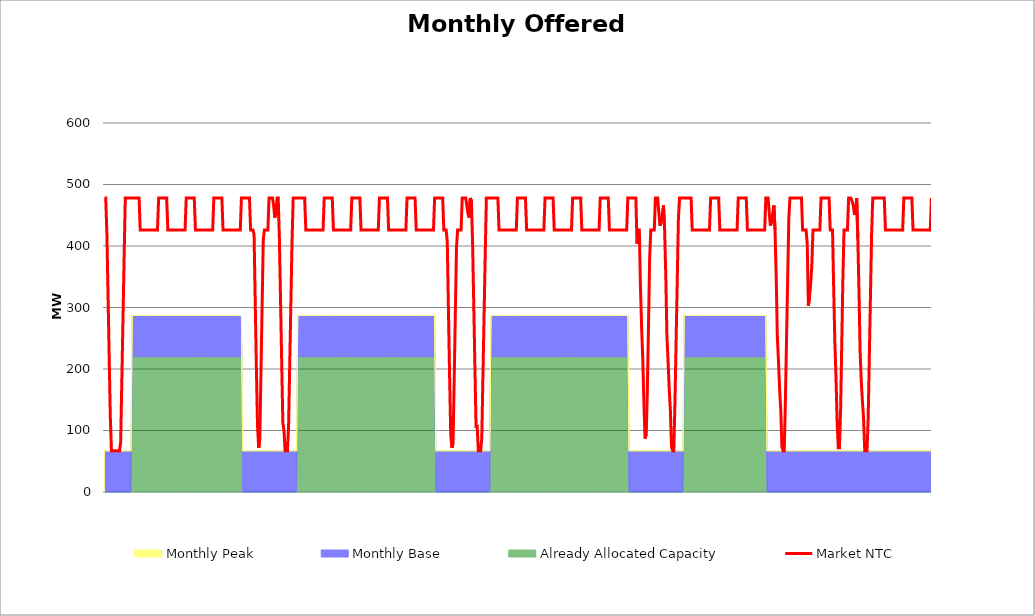
| Category | Market NTC |
|---|---|
| 0 | 478 |
| 1 | 478 |
| 2 | 421 |
| 3 | 321 |
| 4 | 221 |
| 5 | 121 |
| 6 | 67 |
| 7 | 67 |
| 8 | 67 |
| 9 | 67 |
| 10 | 67 |
| 11 | 67 |
| 12 | 67 |
| 13 | 67 |
| 14 | 81 |
| 15 | 181 |
| 16 | 281 |
| 17 | 381 |
| 18 | 478 |
| 19 | 478 |
| 20 | 478 |
| 21 | 478 |
| 22 | 478 |
| 23 | 478 |
| 24 | 478 |
| 25 | 478 |
| 26 | 478 |
| 27 | 478 |
| 28 | 478 |
| 29 | 478 |
| 30 | 478 |
| 31 | 426 |
| 32 | 426 |
| 33 | 426 |
| 34 | 426 |
| 35 | 426 |
| 36 | 426 |
| 37 | 426 |
| 38 | 426 |
| 39 | 426 |
| 40 | 426 |
| 41 | 426 |
| 42 | 426 |
| 43 | 426 |
| 44 | 426 |
| 45 | 426 |
| 46 | 426 |
| 47 | 478 |
| 48 | 478 |
| 49 | 478 |
| 50 | 478 |
| 51 | 478 |
| 52 | 478 |
| 53 | 478 |
| 54 | 478 |
| 55 | 426 |
| 56 | 426 |
| 57 | 426 |
| 58 | 426 |
| 59 | 426 |
| 60 | 426 |
| 61 | 426 |
| 62 | 426 |
| 63 | 426 |
| 64 | 426 |
| 65 | 426 |
| 66 | 426 |
| 67 | 426 |
| 68 | 426 |
| 69 | 426 |
| 70 | 426 |
| 71 | 478 |
| 72 | 478 |
| 73 | 478 |
| 74 | 478 |
| 75 | 478 |
| 76 | 478 |
| 77 | 478 |
| 78 | 478 |
| 79 | 426 |
| 80 | 426 |
| 81 | 426 |
| 82 | 426 |
| 83 | 426 |
| 84 | 426 |
| 85 | 426 |
| 86 | 426 |
| 87 | 426 |
| 88 | 426 |
| 89 | 426 |
| 90 | 426 |
| 91 | 426 |
| 92 | 426 |
| 93 | 426 |
| 94 | 426 |
| 95 | 478 |
| 96 | 478 |
| 97 | 478 |
| 98 | 478 |
| 99 | 478 |
| 100 | 478 |
| 101 | 478 |
| 102 | 478 |
| 103 | 426 |
| 104 | 426 |
| 105 | 426 |
| 106 | 426 |
| 107 | 426 |
| 108 | 426 |
| 109 | 426 |
| 110 | 426 |
| 111 | 426 |
| 112 | 426 |
| 113 | 426 |
| 114 | 426 |
| 115 | 426 |
| 116 | 426 |
| 117 | 426 |
| 118 | 426 |
| 119 | 478 |
| 120 | 478 |
| 121 | 478 |
| 122 | 478 |
| 123 | 478 |
| 124 | 478 |
| 125 | 478 |
| 126 | 478 |
| 127 | 426 |
| 128 | 426 |
| 129 | 426 |
| 130 | 419 |
| 131 | 310 |
| 132 | 202 |
| 133 | 108 |
| 134 | 72 |
| 135 | 87 |
| 136 | 195 |
| 137 | 303 |
| 138 | 411 |
| 139 | 426 |
| 140 | 426 |
| 141 | 426 |
| 142 | 426 |
| 143 | 478 |
| 144 | 478 |
| 145 | 478 |
| 146 | 478 |
| 147 | 466 |
| 148 | 446 |
| 149 | 453 |
| 150 | 478 |
| 151 | 478 |
| 152 | 413 |
| 153 | 313 |
| 154 | 213 |
| 155 | 113 |
| 156 | 100 |
| 157 | 67 |
| 158 | 67 |
| 159 | 67 |
| 160 | 107 |
| 161 | 207 |
| 162 | 307 |
| 163 | 406 |
| 164 | 478 |
| 165 | 478 |
| 166 | 478 |
| 167 | 478 |
| 168 | 478 |
| 169 | 478 |
| 170 | 478 |
| 171 | 478 |
| 172 | 478 |
| 173 | 478 |
| 174 | 478 |
| 175 | 426 |
| 176 | 426 |
| 177 | 426 |
| 178 | 426 |
| 179 | 426 |
| 180 | 426 |
| 181 | 426 |
| 182 | 426 |
| 183 | 426 |
| 184 | 426 |
| 185 | 426 |
| 186 | 426 |
| 187 | 426 |
| 188 | 426 |
| 189 | 426 |
| 190 | 426 |
| 191 | 478 |
| 192 | 478 |
| 193 | 478 |
| 194 | 478 |
| 195 | 478 |
| 196 | 478 |
| 197 | 478 |
| 198 | 478 |
| 199 | 426 |
| 200 | 426 |
| 201 | 426 |
| 202 | 426 |
| 203 | 426 |
| 204 | 426 |
| 205 | 426 |
| 206 | 426 |
| 207 | 426 |
| 208 | 426 |
| 209 | 426 |
| 210 | 426 |
| 211 | 426 |
| 212 | 426 |
| 213 | 426 |
| 214 | 426 |
| 215 | 478 |
| 216 | 478 |
| 217 | 478 |
| 218 | 478 |
| 219 | 478 |
| 220 | 478 |
| 221 | 478 |
| 222 | 478 |
| 223 | 426 |
| 224 | 426 |
| 225 | 426 |
| 226 | 426 |
| 227 | 426 |
| 228 | 426 |
| 229 | 426 |
| 230 | 426 |
| 231 | 426 |
| 232 | 426 |
| 233 | 426 |
| 234 | 426 |
| 235 | 426 |
| 236 | 426 |
| 237 | 426 |
| 238 | 426 |
| 239 | 478 |
| 240 | 478 |
| 241 | 478 |
| 242 | 478 |
| 243 | 478 |
| 244 | 478 |
| 245 | 478 |
| 246 | 478 |
| 247 | 426 |
| 248 | 426 |
| 249 | 426 |
| 250 | 426 |
| 251 | 426 |
| 252 | 426 |
| 253 | 426 |
| 254 | 426 |
| 255 | 426 |
| 256 | 426 |
| 257 | 426 |
| 258 | 426 |
| 259 | 426 |
| 260 | 426 |
| 261 | 426 |
| 262 | 426 |
| 263 | 478 |
| 264 | 478 |
| 265 | 478 |
| 266 | 478 |
| 267 | 478 |
| 268 | 478 |
| 269 | 478 |
| 270 | 478 |
| 271 | 426 |
| 272 | 426 |
| 273 | 426 |
| 274 | 426 |
| 275 | 426 |
| 276 | 426 |
| 277 | 426 |
| 278 | 426 |
| 279 | 426 |
| 280 | 426 |
| 281 | 426 |
| 282 | 426 |
| 283 | 426 |
| 284 | 426 |
| 285 | 426 |
| 286 | 426 |
| 287 | 478 |
| 288 | 478 |
| 289 | 478 |
| 290 | 478 |
| 291 | 478 |
| 292 | 478 |
| 293 | 478 |
| 294 | 478 |
| 295 | 426 |
| 296 | 426 |
| 297 | 426 |
| 298 | 407 |
| 299 | 298 |
| 300 | 190 |
| 301 | 94 |
| 302 | 72 |
| 303 | 79 |
| 304 | 180 |
| 305 | 289 |
| 306 | 397 |
| 307 | 426 |
| 308 | 426 |
| 309 | 426 |
| 310 | 426 |
| 311 | 478 |
| 312 | 478 |
| 313 | 478 |
| 314 | 478 |
| 315 | 466 |
| 316 | 453 |
| 317 | 446 |
| 318 | 478 |
| 319 | 473 |
| 320 | 406 |
| 321 | 307 |
| 322 | 207 |
| 323 | 107 |
| 324 | 107 |
| 325 | 67 |
| 326 | 67 |
| 327 | 67 |
| 328 | 87 |
| 329 | 187 |
| 330 | 287 |
| 331 | 386 |
| 332 | 478 |
| 333 | 478 |
| 334 | 478 |
| 335 | 478 |
| 336 | 478 |
| 337 | 478 |
| 338 | 478 |
| 339 | 478 |
| 340 | 478 |
| 341 | 478 |
| 342 | 478 |
| 343 | 426 |
| 344 | 426 |
| 345 | 426 |
| 346 | 426 |
| 347 | 426 |
| 348 | 426 |
| 349 | 426 |
| 350 | 426 |
| 351 | 426 |
| 352 | 426 |
| 353 | 426 |
| 354 | 426 |
| 355 | 426 |
| 356 | 426 |
| 357 | 426 |
| 358 | 426 |
| 359 | 478 |
| 360 | 478 |
| 361 | 478 |
| 362 | 478 |
| 363 | 478 |
| 364 | 478 |
| 365 | 478 |
| 366 | 478 |
| 367 | 426 |
| 368 | 426 |
| 369 | 426 |
| 370 | 426 |
| 371 | 426 |
| 372 | 426 |
| 373 | 426 |
| 374 | 426 |
| 375 | 426 |
| 376 | 426 |
| 377 | 426 |
| 378 | 426 |
| 379 | 426 |
| 380 | 426 |
| 381 | 426 |
| 382 | 426 |
| 383 | 478 |
| 384 | 478 |
| 385 | 478 |
| 386 | 478 |
| 387 | 478 |
| 388 | 478 |
| 389 | 478 |
| 390 | 478 |
| 391 | 426 |
| 392 | 426 |
| 393 | 426 |
| 394 | 426 |
| 395 | 426 |
| 396 | 426 |
| 397 | 426 |
| 398 | 426 |
| 399 | 426 |
| 400 | 426 |
| 401 | 426 |
| 402 | 426 |
| 403 | 426 |
| 404 | 426 |
| 405 | 426 |
| 406 | 426 |
| 407 | 478 |
| 408 | 478 |
| 409 | 478 |
| 410 | 478 |
| 411 | 478 |
| 412 | 478 |
| 413 | 478 |
| 414 | 478 |
| 415 | 426 |
| 416 | 426 |
| 417 | 426 |
| 418 | 426 |
| 419 | 426 |
| 420 | 426 |
| 421 | 426 |
| 422 | 426 |
| 423 | 426 |
| 424 | 426 |
| 425 | 426 |
| 426 | 426 |
| 427 | 426 |
| 428 | 426 |
| 429 | 426 |
| 430 | 426 |
| 431 | 478 |
| 432 | 478 |
| 433 | 478 |
| 434 | 478 |
| 435 | 478 |
| 436 | 478 |
| 437 | 478 |
| 438 | 478 |
| 439 | 426 |
| 440 | 426 |
| 441 | 426 |
| 442 | 426 |
| 443 | 426 |
| 444 | 426 |
| 445 | 426 |
| 446 | 426 |
| 447 | 426 |
| 448 | 426 |
| 449 | 426 |
| 450 | 426 |
| 451 | 426 |
| 452 | 426 |
| 453 | 426 |
| 454 | 426 |
| 455 | 478 |
| 456 | 478 |
| 457 | 478 |
| 458 | 478 |
| 459 | 478 |
| 460 | 478 |
| 461 | 478 |
| 462 | 478 |
| 463 | 404 |
| 464 | 426 |
| 465 | 426 |
| 466 | 332 |
| 467 | 267 |
| 468 | 216 |
| 469 | 144 |
| 470 | 87 |
| 471 | 94 |
| 472 | 166 |
| 473 | 274 |
| 474 | 382 |
| 475 | 426 |
| 476 | 426 |
| 477 | 426 |
| 478 | 426 |
| 479 | 478 |
| 480 | 478 |
| 481 | 478 |
| 482 | 453 |
| 483 | 433 |
| 484 | 440 |
| 485 | 453 |
| 486 | 466 |
| 487 | 426 |
| 488 | 353 |
| 489 | 253 |
| 490 | 213 |
| 491 | 167 |
| 492 | 133 |
| 493 | 73 |
| 494 | 67 |
| 495 | 67 |
| 496 | 147 |
| 497 | 247 |
| 498 | 346 |
| 499 | 446 |
| 500 | 478 |
| 501 | 478 |
| 502 | 478 |
| 503 | 478 |
| 504 | 478 |
| 505 | 478 |
| 506 | 478 |
| 507 | 478 |
| 508 | 478 |
| 509 | 478 |
| 510 | 478 |
| 511 | 426 |
| 512 | 426 |
| 513 | 426 |
| 514 | 426 |
| 515 | 426 |
| 516 | 426 |
| 517 | 426 |
| 518 | 426 |
| 519 | 426 |
| 520 | 426 |
| 521 | 426 |
| 522 | 426 |
| 523 | 426 |
| 524 | 426 |
| 525 | 426 |
| 526 | 426 |
| 527 | 478 |
| 528 | 478 |
| 529 | 478 |
| 530 | 478 |
| 531 | 478 |
| 532 | 478 |
| 533 | 478 |
| 534 | 478 |
| 535 | 426 |
| 536 | 426 |
| 537 | 426 |
| 538 | 426 |
| 539 | 426 |
| 540 | 426 |
| 541 | 426 |
| 542 | 426 |
| 543 | 426 |
| 544 | 426 |
| 545 | 426 |
| 546 | 426 |
| 547 | 426 |
| 548 | 426 |
| 549 | 426 |
| 550 | 426 |
| 551 | 478 |
| 552 | 478 |
| 553 | 478 |
| 554 | 478 |
| 555 | 478 |
| 556 | 478 |
| 557 | 478 |
| 558 | 478 |
| 559 | 426 |
| 560 | 426 |
| 561 | 426 |
| 562 | 426 |
| 563 | 426 |
| 564 | 426 |
| 565 | 426 |
| 566 | 426 |
| 567 | 426 |
| 568 | 426 |
| 569 | 426 |
| 570 | 426 |
| 571 | 426 |
| 572 | 426 |
| 573 | 426 |
| 574 | 426 |
| 575 | 478 |
| 576 | 478 |
| 577 | 478 |
| 578 | 453 |
| 579 | 433 |
| 580 | 440 |
| 581 | 453 |
| 582 | 466 |
| 583 | 426 |
| 584 | 353 |
| 585 | 253 |
| 586 | 213 |
| 587 | 167 |
| 588 | 133 |
| 589 | 73 |
| 590 | 67 |
| 591 | 67 |
| 592 | 147 |
| 593 | 247 |
| 594 | 346 |
| 595 | 446 |
| 596 | 478 |
| 597 | 478 |
| 598 | 478 |
| 599 | 478 |
| 600 | 478 |
| 601 | 478 |
| 602 | 478 |
| 603 | 478 |
| 604 | 478 |
| 605 | 478 |
| 606 | 478 |
| 607 | 426 |
| 608 | 426 |
| 609 | 426 |
| 610 | 426 |
| 611 | 404 |
| 612 | 303 |
| 613 | 318 |
| 614 | 339 |
| 615 | 368 |
| 616 | 426 |
| 617 | 426 |
| 618 | 426 |
| 619 | 426 |
| 620 | 426 |
| 621 | 426 |
| 622 | 426 |
| 623 | 478 |
| 624 | 478 |
| 625 | 478 |
| 626 | 478 |
| 627 | 478 |
| 628 | 478 |
| 629 | 478 |
| 630 | 478 |
| 631 | 426 |
| 632 | 426 |
| 633 | 426 |
| 634 | 332 |
| 635 | 245 |
| 636 | 188 |
| 637 | 115 |
| 638 | 72 |
| 639 | 72 |
| 640 | 130 |
| 641 | 238 |
| 642 | 346 |
| 643 | 426 |
| 644 | 426 |
| 645 | 426 |
| 646 | 426 |
| 647 | 478 |
| 648 | 478 |
| 649 | 478 |
| 650 | 473 |
| 651 | 466 |
| 652 | 453 |
| 653 | 453 |
| 654 | 478 |
| 655 | 413 |
| 656 | 326 |
| 657 | 227 |
| 658 | 180 |
| 659 | 147 |
| 660 | 120 |
| 661 | 67 |
| 662 | 67 |
| 663 | 67 |
| 664 | 120 |
| 665 | 220 |
| 666 | 320 |
| 667 | 420 |
| 668 | 478 |
| 669 | 478 |
| 670 | 478 |
| 671 | 478 |
| 672 | 478 |
| 673 | 478 |
| 674 | 478 |
| 675 | 478 |
| 676 | 478 |
| 677 | 478 |
| 678 | 478 |
| 679 | 426 |
| 680 | 426 |
| 681 | 426 |
| 682 | 426 |
| 683 | 426 |
| 684 | 426 |
| 685 | 426 |
| 686 | 426 |
| 687 | 426 |
| 688 | 426 |
| 689 | 426 |
| 690 | 426 |
| 691 | 426 |
| 692 | 426 |
| 693 | 426 |
| 694 | 426 |
| 695 | 478 |
| 696 | 478 |
| 697 | 478 |
| 698 | 478 |
| 699 | 478 |
| 700 | 478 |
| 701 | 478 |
| 702 | 478 |
| 703 | 426 |
| 704 | 426 |
| 705 | 426 |
| 706 | 426 |
| 707 | 426 |
| 708 | 426 |
| 709 | 426 |
| 710 | 426 |
| 711 | 426 |
| 712 | 426 |
| 713 | 426 |
| 714 | 426 |
| 715 | 426 |
| 716 | 426 |
| 717 | 426 |
| 718 | 426 |
| 719 | 478 |